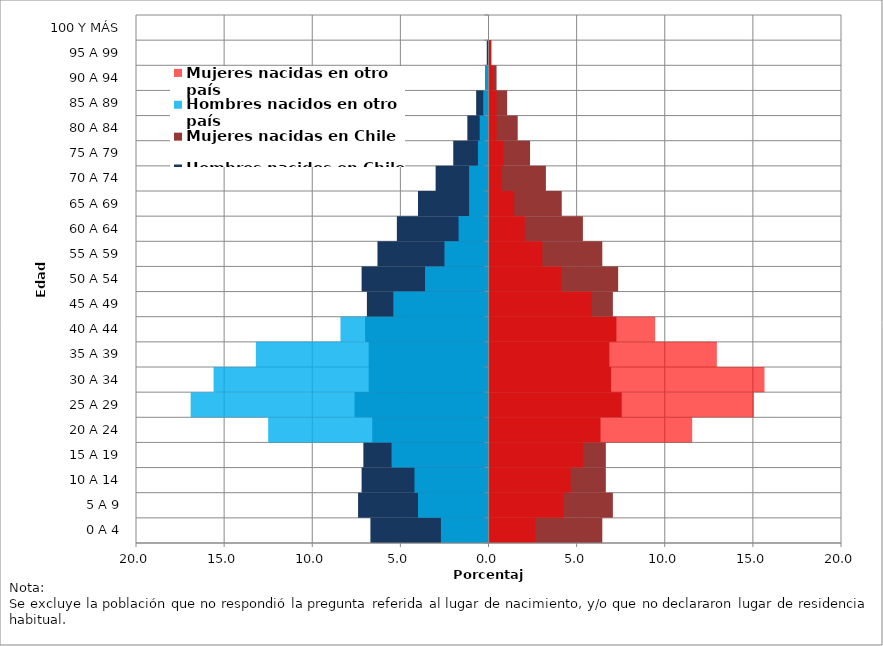
| Category | Hombres nacidos en Chile | Mujeres nacidas en Chile | Hombres nacidos en otro país | Mujeres nacidas en otro país |
|---|---|---|---|---|
| 0 A 4 | -6.7 | 6.4 | -2.7 | 2.6 |
| 5 A 9 | -7.4 | 7 | -4 | 4.2 |
| 10 A 14 | -7.2 | 6.6 | -4.2 | 4.6 |
| 15 A 19 | -7.1 | 6.6 | -5.5 | 5.3 |
| 20 A 24 | -6.6 | 6.3 | -12.5 | 11.5 |
| 25 A 29 | -7.6 | 7.5 | -16.9 | 15 |
| 30 A 34 | -6.8 | 6.9 | -15.6 | 15.6 |
| 35 A 39 | -6.8 | 6.8 | -13.2 | 12.9 |
| 40 A 44 | -7 | 7.2 | -8.4 | 9.4 |
| 45 A 49 | -6.9 | 7 | -5.4 | 5.8 |
| 50 A 54 | -7.2 | 7.3 | -3.6 | 4.1 |
| 55 A 59 | -6.3 | 6.4 | -2.5 | 3 |
| 60 A 64 | -5.2 | 5.3 | -1.7 | 2 |
| 65 A 69 | -4 | 4.1 | -1.1 | 1.4 |
| 70 A 74 | -3 | 3.2 | -1.1 | 0.7 |
| 75 A 79 | -2 | 2.3 | -0.6 | 0.8 |
| 80 A 84 | -1.2 | 1.6 | -0.5 | 0.4 |
| 85 A 89 | -0.7 | 1 | -0.3 | 0.4 |
| 90 A 94 | -0.2 | 0.4 | -0.2 | 0.2 |
| 95 A 99 | -0.1 | 0.1 | 0 | 0.1 |
| 100 Y MÁS | 0 | 0 | 0 | 0 |